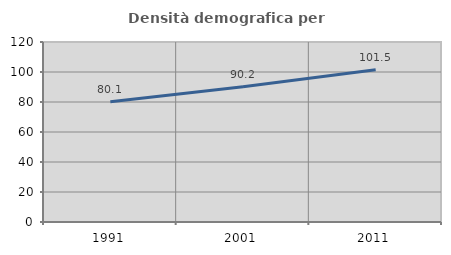
| Category | Densità demografica |
|---|---|
| 1991.0 | 80.133 |
| 2001.0 | 90.185 |
| 2011.0 | 101.539 |